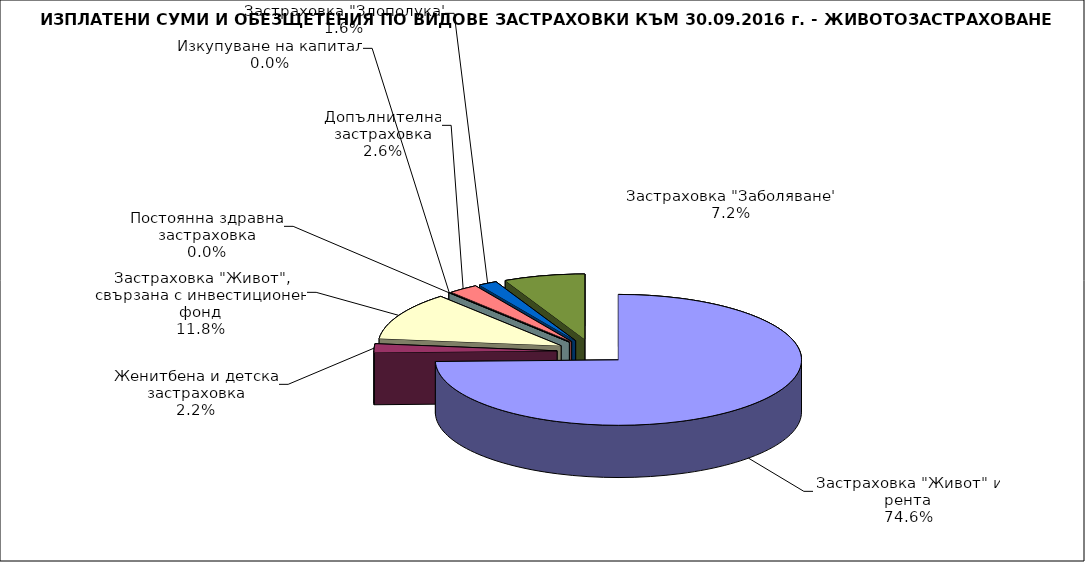
| Category | Series 0 |
|---|---|
| Застраховка "Живот" и рента | 0.746 |
| Женитбена и детска застраховка | 0.022 |
| Застраховка "Живот", свързана с инвестиционен фонд | 0.118 |
| Постоянна здравна застраховка | 0 |
| Изкупуване на капитал | 0 |
| Допълнителна застраховка | 0.026 |
| Застраховка "Злополука" | 0.016 |
| Застраховка "Заболяване" | 0.072 |